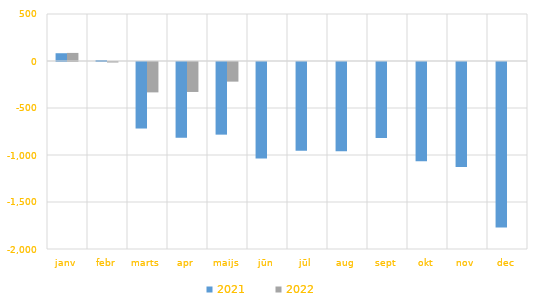
| Category | 2021 | 2022 |
|---|---|---|
| janv | 82687.376 | 85977.566 |
| febr | 10789.506 | -5472.016 |
| marts | -707667.142 | -323198.32 |
| apr | -805934.062 | -318736.122 |
| maijs | -772767.286 | -208915.202 |
| jūn | -1025311.488 | 0 |
| jūl | -945181.179 | 0 |
| aug | -949030.982 | 0 |
| sept | -808331.47 | 0 |
| okt | -1054736.124 | 0 |
| nov | -1116758.714 | 0 |
| dec | -1760352.308 | 0 |